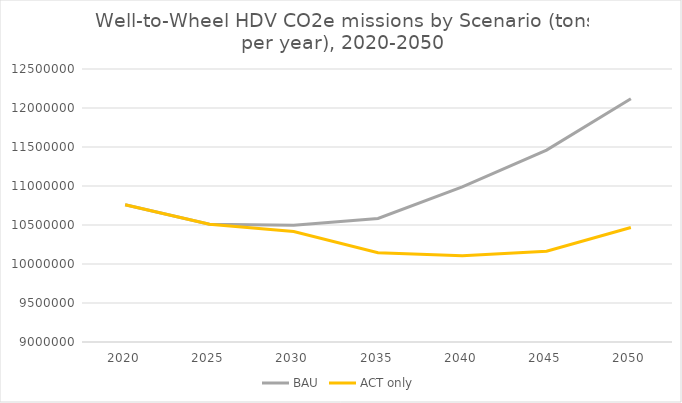
| Category | BAU | ACT only |
|---|---|---|
| 2020.0 | 10759575.702 | 10759575.702 |
| 2025.0 | 10509518.883 | 10509518.883 |
| 2030.0 | 10497113.071 | 10417510.743 |
| 2035.0 | 10583645.958 | 10145287.43 |
| 2040.0 | 10989642.298 | 10104841.064 |
| 2045.0 | 11460658.579 | 10164612.215 |
| 2050.0 | 12118026.401 | 10467061.962 |